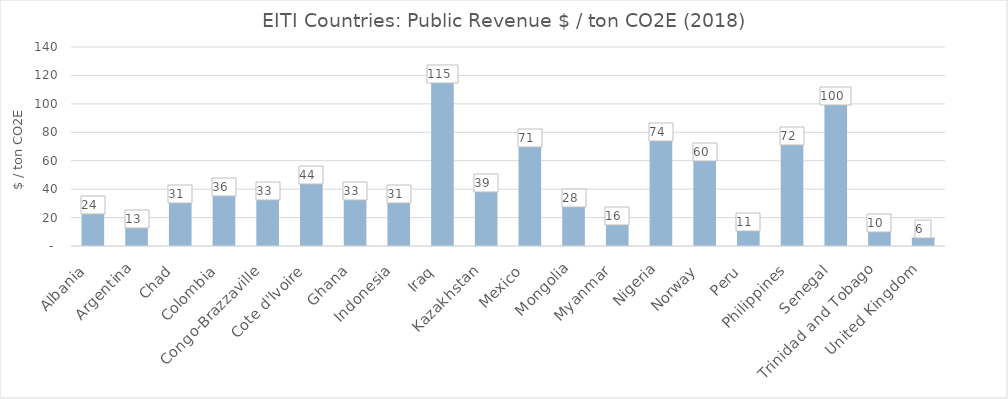
| Category | Series 0 |
|---|---|
|  Albania  | 23.534 |
|  Argentina  | 13.09 |
|  Chad  | 30.974 |
|  Colombia  | 35.605 |
|  Congo-Brazzaville  | 33.413 |
|  Cote d'Ivoire  | 44.206 |
|  Ghana  | 33.143 |
|  Indonesia  | 30.979 |
|  Iraq  | 115.094 |
|  Kazakhstan  | 38.773 |
|  Mexico   | 70.677 |
|  Mongolia  | 28.095 |
|  Myanmar  | 15.653 |
|  Nigeria  | 74.5 |
|  Norway  | 60.25 |
|  Peru  | 11.124 |
|  Philippines  | 71.619 |
|  Senegal  | 99.617 |
|  Trinidad and Tobago  | 10.318 |
|  United Kingdom  | 5.985 |